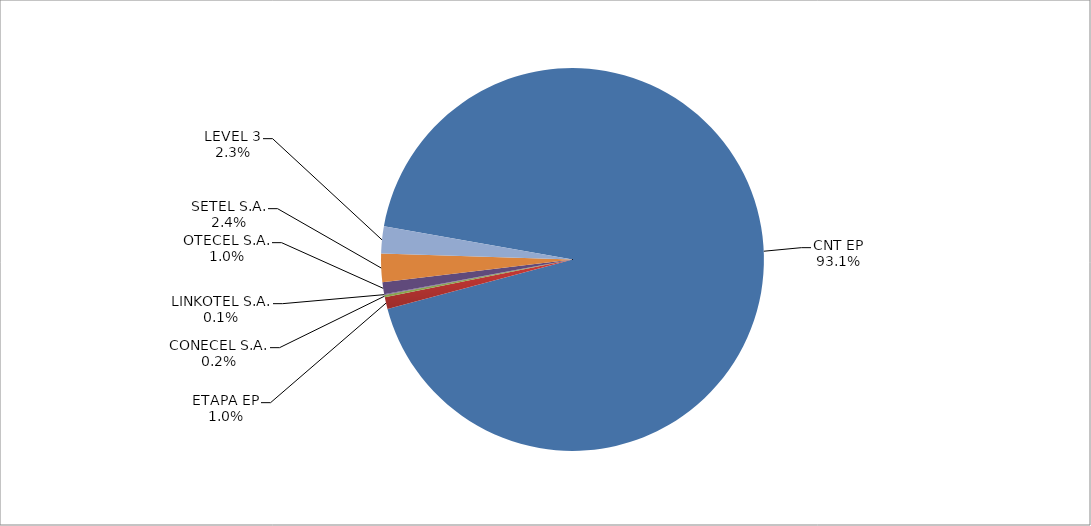
| Category | Series 0 |
|---|---|
| CNT EP | 2524 |
| ETAPA EP | 27 |
| CONECEL S.A. | 5 |
| LINKOTEL S.A. | 2 |
| OTECEL S.A. | 27 |
| SETEL S.A. | 65 |
| LEVEL 3 | 62 |